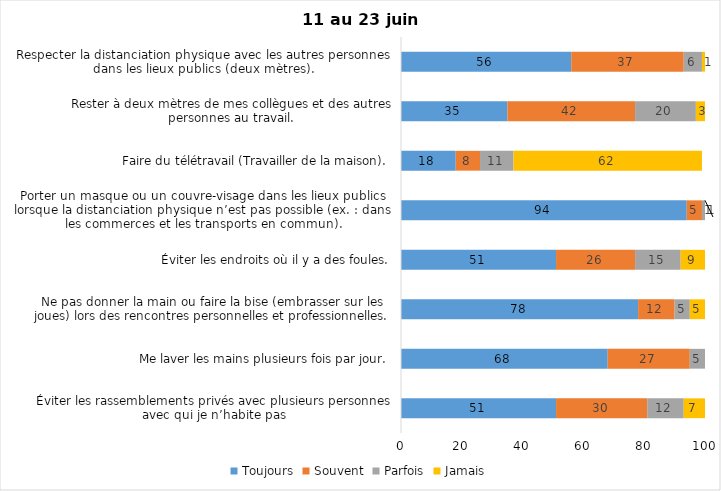
| Category | Toujours | Souvent | Parfois | Jamais |
|---|---|---|---|---|
| Éviter les rassemblements privés avec plusieurs personnes avec qui je n’habite pas | 51 | 30 | 12 | 7 |
| Me laver les mains plusieurs fois par jour. | 68 | 27 | 5 | 0 |
| Ne pas donner la main ou faire la bise (embrasser sur les joues) lors des rencontres personnelles et professionnelles. | 78 | 12 | 5 | 5 |
| Éviter les endroits où il y a des foules. | 51 | 26 | 15 | 9 |
| Porter un masque ou un couvre-visage dans les lieux publics lorsque la distanciation physique n’est pas possible (ex. : dans les commerces et les transports en commun). | 94 | 5 | 1 | 1 |
| Faire du télétravail (Travailler de la maison). | 18 | 8 | 11 | 62 |
| Rester à deux mètres de mes collègues et des autres personnes au travail. | 35 | 42 | 20 | 3 |
| Respecter la distanciation physique avec les autres personnes dans les lieux publics (deux mètres). | 56 | 37 | 6 | 1 |